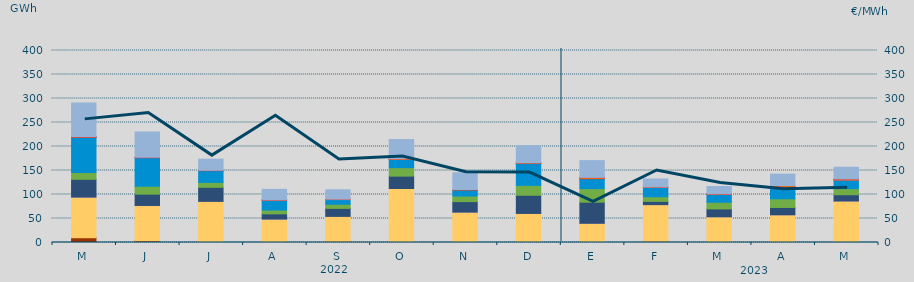
| Category | Carbón | Ciclo Combinado | Cogeneración | Consumo Bombeo | Eólica | Hidráulica | Nuclear | Otras Renovables | Solar fotovoltaica | Solar térmica | Turbinación bombeo |
|---|---|---|---|---|---|---|---|---|---|---|---|
| M | 10012.495 | 84316.131 | 342.191 | 36920.803 | 14355.123 | 73448.126 | 0.3 | 0 | 350.4 | 549.325 | 70399.534 |
| J | 3803.776 | 72994.164 | 408.816 | 23523.459 | 16484.811 | 59296.475 | 327.825 | 3.325 | 281.65 | 342.175 | 52808.788 |
| J | 2026.357 | 83630.229 | 62.5 | 29193.443 | 10247.658 | 24517.982 | 107.35 | 0 | 186.925 | 340.15 | 23284.195 |
| A | 608.425 | 48201.184 | 25.75 | 10881.743 | 7912.923 | 20661.25 | 49.5 | 8.225 | 251.425 | 88.725 | 21982.08 |
| S | 2432.475 | 52018.85 | 0.5 | 16627 | 8549.825 | 9810.3 | 0 | 23 | 777.175 | 6.75 | 19642.325 |
| O | 1876.1 | 110603.205 | 45 | 25745.4 | 17659.375 | 17006.05 | 12.825 | 16.6 | 1409.775 | 15.5 | 40055.836 |
| N | 1396.025 | 61724.955 | 198.008 | 21869.975 | 11579.495 | 12449.175 | 266.725 | 0 | 996.225 | 0 | 34713.224 |
| D | 1126.208 | 59335.684 | 104.85 | 37837.8 | 20596.98 | 45465.168 | 544.3 | 0 | 1011.875 | 1.5 | 35471.986 |
| E | 478.95 | 39560.875 | 26.867 | 43909.242 | 28275.092 | 20601.292 | 143.6 | 0 | 2603.242 | 1.5 | 34937.333 |
| F | 2850.925 | 76083.275 | 1.55 | 6739.65 | 9661.175 | 19240.1 | 0 | 0 | 962.675 | 47.25 | 16781.025 |
| M | 1195.025 | 52392.533 | 3.3 | 16393.158 | 13789.6 | 16980.517 | 40.625 | 4.5 | 911.6 | 43.15 | 14940.475 |
| A | 218.875 | 57485.65 | 46.225 | 15258.175 | 18096.25 | 24086.65 | 63.45 | 0 | 3316.075 | 0 | 23819.559 |
| M | 150.482 | 86315.465 | 30 | 13099.874 | 12607.441 | 17784.926 | 256.325 | 2 | 2256.963 | 1.5 | 24199.004 |